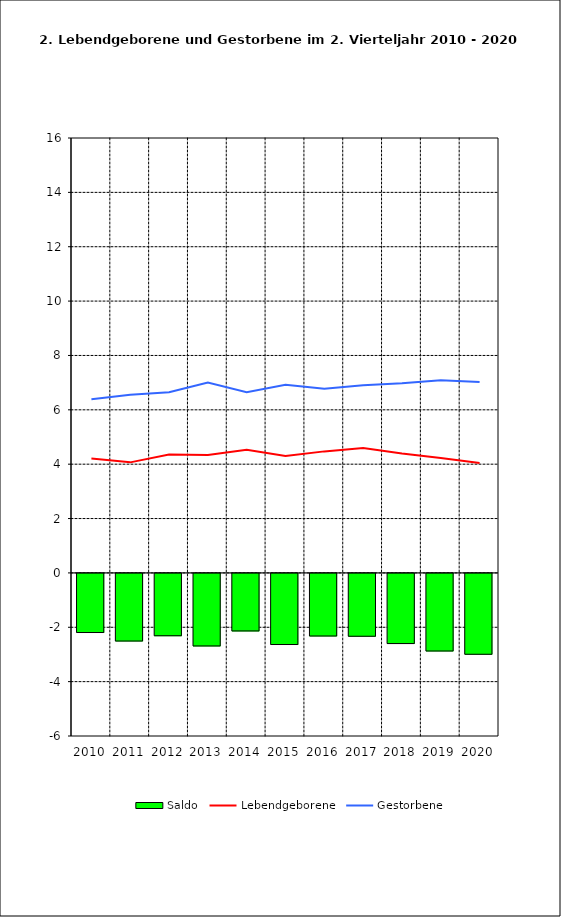
| Category | Saldo |
|---|---|
| 2010.0 | -2.175 |
| 2011.0 | -2.488 |
| 2012.0 | -2.293 |
| 2013.0 | -2.669 |
| 2014.0 | -2.117 |
| 2015.0 | -2.616 |
| 2016.0 | -2.303 |
| 2017.0 | -2.312 |
| 2018.0 | -2.581 |
| 2019.0 | -2.855 |
| 2020.0 | -2.975 |